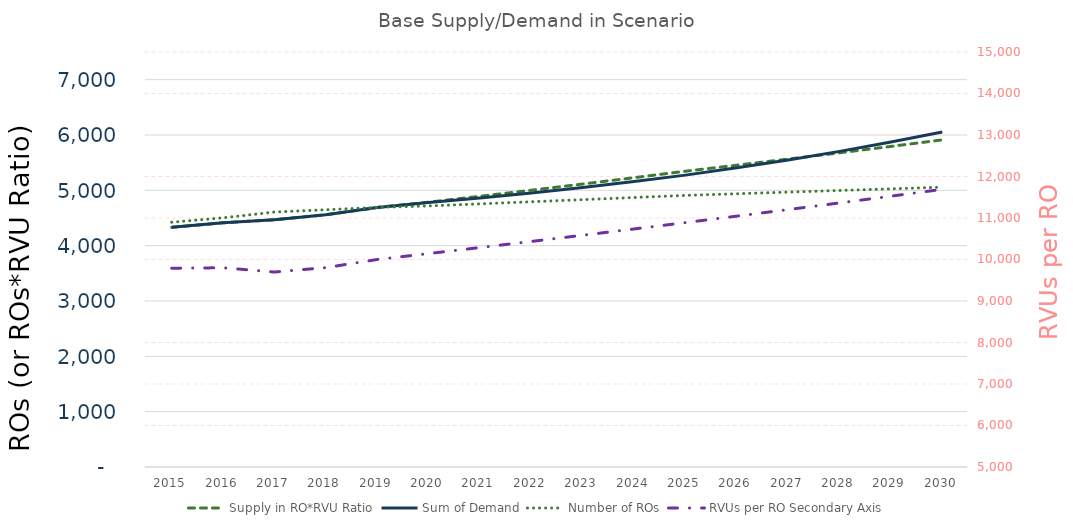
| Category | Supply in RO*RVU Ratio | Sum of Demand | Number of ROs |
|---|---|---|---|
| 2015.0 | 4330.918 | 4330.918 | 4424 |
| 2016.0 | 4413.407 | 4413.407 | 4503 |
| 2017.0 | 4468.855 | 4468.855 | 4608 |
| 2018.0 | 4558.145 | 4558.145 | 4649 |
| 2019.0 | 4691 | 4691 | 4691 |
| 2020.0 | 4785.474 | 4779.319 | 4718 |
| 2021.0 | 4892.593 | 4862.706 | 4755.596 |
| 2022.0 | 5002.109 | 4953.383 | 4793.492 |
| 2023.0 | 5114.077 | 5051.895 | 4831.689 |
| 2024.0 | 5228.551 | 5158.831 | 4870.191 |
| 2025.0 | 5345.587 | 5274.822 | 4909 |
| 2026.0 | 5454.344 | 5406.713 | 4938.249 |
| 2027.0 | 5565.312 | 5549.598 | 4967.673 |
| 2028.0 | 5678.539 | 5704.32 | 4997.272 |
| 2029.0 | 5794.069 | 5871.793 | 5027.047 |
| 2030.0 | 5911.949 | 6052.999 | 5057 |